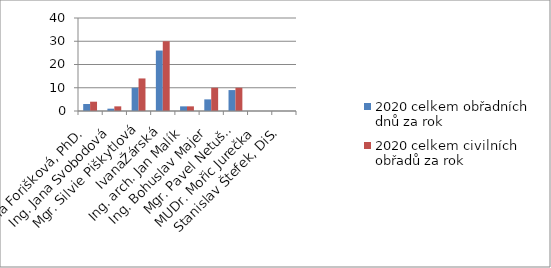
| Category | 2020 |
|---|---|
| Ing. Dana Forišková, PhD. | 4 |
| Ing. Jana Svobodová | 2 |
| Mgr. Silvie Piškytlová | 14 |
| IvanaŽárská | 30 |
| Ing. arch. Jan Malík | 2 |
| Ing. Bohuslav Majer | 10 |
| Mgr. Pavel Netušil | 10 |
| MUDr. Mořic Jurečka | 0 |
| Stanislav Štefek, DiS. | 0 |